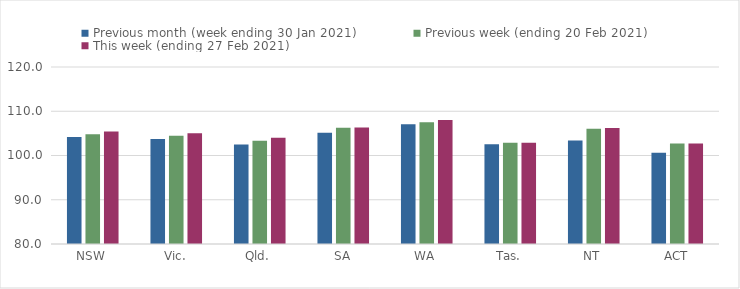
| Category | Previous month (week ending 30 Jan 2021) | Previous week (ending 20 Feb 2021) | This week (ending 27 Feb 2021) |
|---|---|---|---|
| NSW | 104.17 | 104.81 | 105.42 |
| Vic. | 103.72 | 104.44 | 105.01 |
| Qld. | 102.47 | 103.36 | 104.02 |
| SA | 105.15 | 106.27 | 106.32 |
| WA | 107.05 | 107.49 | 108.04 |
| Tas. | 102.52 | 102.89 | 102.89 |
| NT | 103.4 | 106.02 | 106.2 |
| ACT | 100.62 | 102.7 | 102.73 |